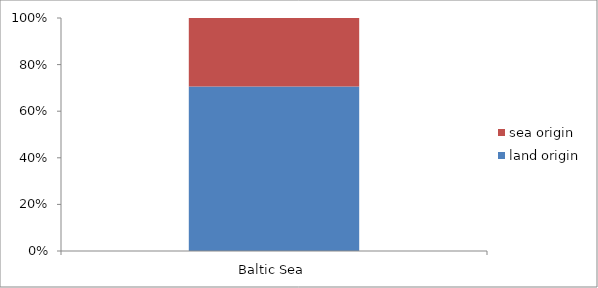
| Category | land origin | sea origin |
|---|---|---|
| Baltic Sea | 75354 | 31447.75 |